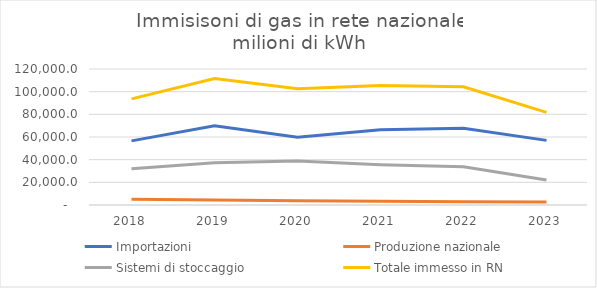
| Category | Importazioni | Produzione nazionale | Sistemi di stoccaggio | Totale immesso in RN |
|---|---|---|---|---|
| 2018.0 | 56565.89 | 5170.141 | 31939.316 | 93675.347 |
| 2019.0 | 69915.767 | 4434.563 | 37309.227 | 111659.557 |
| 2020.0 | 59852.903 | 3791.405 | 38903.987 | 102548.295 |
| 2021.0 | 66486.422 | 3356.041 | 35593.917 | 105436.38 |
| 2022.0 | 67744.609 | 2845.891 | 33703.733 | 104294.233 |
| 2023.0 | 57022.574 | 2677.366 | 21997.59 | 81697.53 |